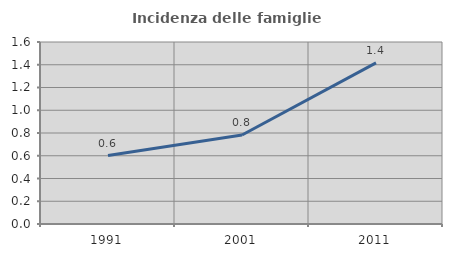
| Category | Incidenza delle famiglie numerose |
|---|---|
| 1991.0 | 0.602 |
| 2001.0 | 0.782 |
| 2011.0 | 1.416 |